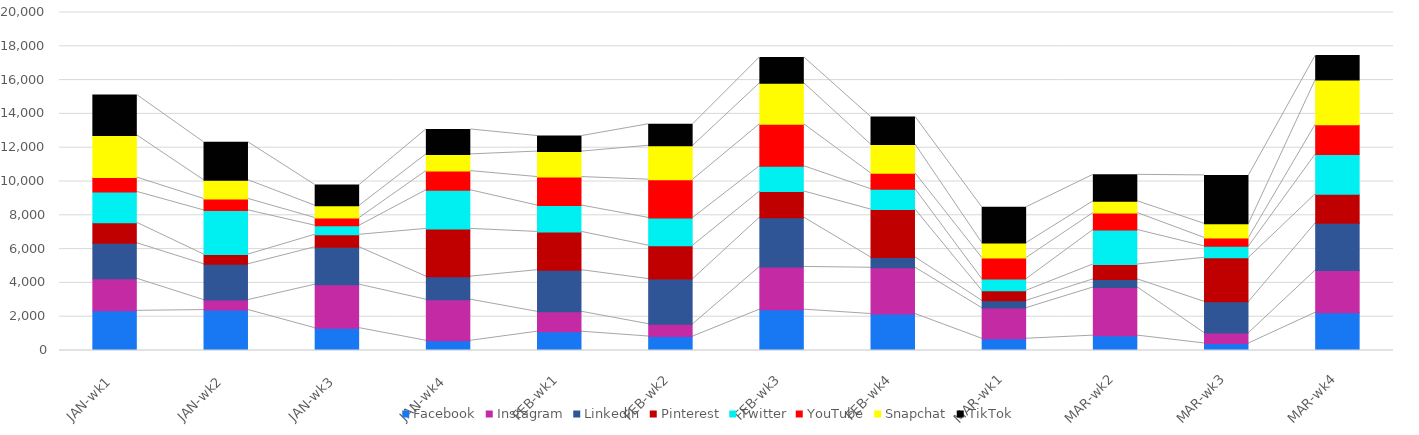
| Category | Facebook | Instagram | LinkedIn | Pinterest | Twitter | YouTube | Snapchat | TikTok |
|---|---|---|---|---|---|---|---|---|
| JAN-wk1 | 2346 | 1898 | 2101 | 1207 | 1830 | 848 | 2493 | 2390 |
| JAN-wk2 | 2393 | 591 | 2119 | 574 | 2614 | 677 | 1106 | 2244 |
| JAN-wk3 | 1321 | 2573 | 2214 | 740 | 538 | 457 | 725 | 1225 |
| JAN-wk4 | 576 | 2430 | 1365 | 2825 | 2286 | 1132 | 990 | 1475 |
| FEB-wk1 | 1112 | 1178 | 2462 | 2264 | 1560 | 1687 | 1508 | 918 |
| FEB-wk2 | 827 | 732 | 2668 | 1978 | 1642 | 2260 | 2008 | 1272 |
| FEB-wk3 | 2417 | 2528 | 2914 | 1548 | 1493 | 2482 | 2426 | 1532 |
| FEB-wk4 | 2159 | 2737 | 611 | 2834 | 1204 | 936 | 1707 | 1634 |
| MAR-wk1 | 697 | 1812 | 433 | 595 | 691 | 1250 | 887 | 2112 |
| MAR-wk2 | 880 | 2848 | 480 | 884 | 2035 | 1005 | 695 | 1567 |
| MAR-wk3 | 417 | 616 | 1847 | 2605 | 677 | 502 | 832 | 2864 |
| MAR-wk4 | 2235 | 2501 | 2788 | 1725 | 2352 | 1761 | 2641 | 1447 |